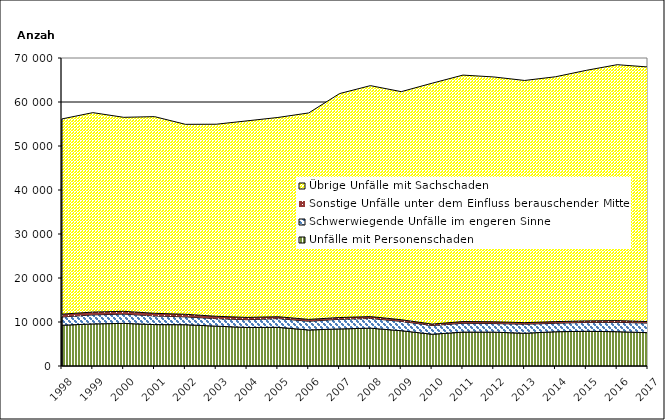
| Category | Unfälle mit Personenschaden | Schwerwiegende Unfälle im engeren Sinne | Sonstige Unfälle unter dem Einfluss berauschender Mittel 1) | Übrige Unfälle mit Sachschaden |
|---|---|---|---|---|
| 1998.0 | 9264 | 1869 | 648 | 44374 |
| 1999.0 | 9566 | 2055 | 634 | 45326 |
| 2000.0 | 9684 | 2114 | 632 | 44087 |
| 2001.0 | 9410 | 1972 | 596 | 44696 |
| 2002.0 | 9383 | 1782 | 592 | 43169 |
| 2003.0 | 9058 | 1702 | 542 | 43646 |
| 2004.0 | 8755 | 1770 | 513 | 44673 |
| 2005.0 | 8788 | 1991 | 422 | 45281 |
| 2006.0 | 8190 | 1977 | 424 | 46926 |
| 2007.0 | 8426 | 2186 | 404 | 50897 |
| 2008.0 | 8594 | 2206 | 432 | 52488 |
| 2009.0 | 8022 | 2115 | 380 | 51835 |
| 2010.0 | 7217 | 1987 | 324 | 54741 |
| 2011.0 | 7704 | 2003 | 394 | 56014 |
| 2012.0 | 7691 | 1958 | 401 | 55640 |
| 2013.0 | 7443 | 2059 | 355 | 55040 |
| 2014.0 | 7787 | 1921 | 380 | 55646 |
| 2015.0 | 7881 | 2030 | 341 | 56944 |
| 2016.0 | 7795 | 2138 | 392 | 58152 |
| 2017.0 | 7572 | 2169 | 356 | 57863 |